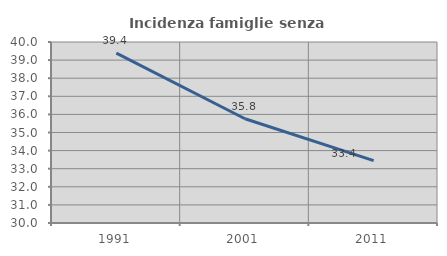
| Category | Incidenza famiglie senza nuclei |
|---|---|
| 1991.0 | 39.384 |
| 2001.0 | 35.762 |
| 2011.0 | 33.449 |